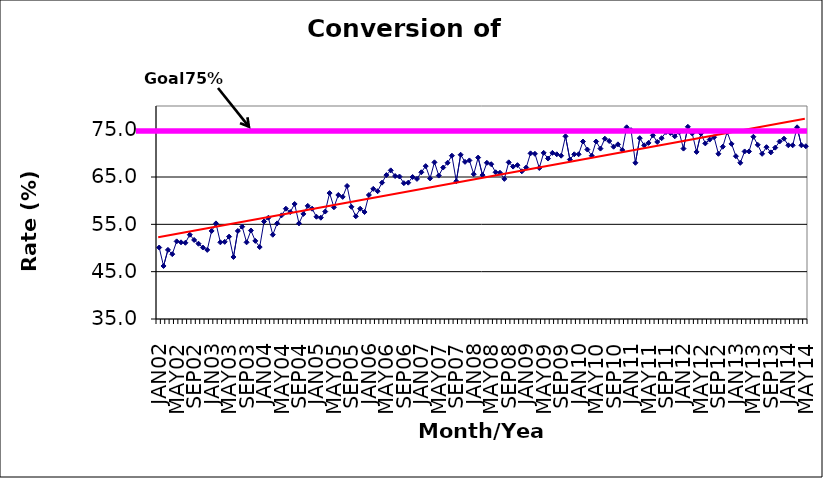
| Category | Series 0 |
|---|---|
| JAN02 | 50.1 |
| FEB02 | 46.2 |
| MAR02 | 49.6 |
| APR02 | 48.7 |
| MAY02 | 51.4 |
| JUN02 | 51.2 |
| JUL02 | 51.1 |
| AUG02 | 52.8 |
| SEP02 | 51.7 |
| OCT02 | 50.9 |
| NOV02 | 50.1 |
| DEC02 | 49.6 |
| JAN03 | 53.6 |
| FEB03 | 55.2 |
| MAR03 | 51.2 |
| APR03 | 51.3 |
| MAY03 | 52.4 |
| JUN03 | 48.1 |
| JUL03 | 53.6 |
| AUG03 | 54.5 |
| SEP03 | 51.2 |
| OCT03 | 53.7 |
| NOV03 | 51.5 |
| DEC03 | 50.2 |
| JAN04 | 55.6 |
| FEB04 | 56.4 |
| MAR04 | 52.8 |
| APR04 | 55.2 |
| MAY04 | 56.9 |
| JUN04 | 58.3 |
| JUL04 | 57.6 |
| AUG04 | 59.3 |
| SEP04 | 55.2 |
| OCT04 | 57.2 |
| NOV04 | 58.9 |
| DEC04 | 58.3 |
| JAN05 | 56.6 |
| FEB05 | 56.4 |
| MAR05 | 57.7 |
| APR05 | 61.6 |
| MAY05 | 58.6 |
| JUN05 | 61.2 |
| JUL05 | 60.8 |
| AUG05 | 63.1 |
| SEP05 | 58.7 |
| OCT05 | 56.7 |
| NOV05 | 58.3 |
| DEC05 | 57.6 |
| JAN06 | 61.2 |
| FEB06 | 62.5 |
| MAR06 | 62 |
| APR06 | 63.8 |
| MAY06 | 65.4 |
| JUN06 | 66.4 |
| JUL06 | 65.2 |
| AUG06 | 65.1 |
| SEP06 | 63.7 |
| OCT06 | 63.8 |
| NOV06 | 65 |
| DEC06 | 64.6 |
| JAN07 | 66 |
| FEB07 | 67.3 |
| MAR07 | 64.7 |
| APR07 | 68.1 |
| MAY07 | 65.3 |
| JUN07 | 67 |
| JUL07 | 68 |
| AUG07 | 69.5 |
| SEP07 | 64.1 |
| OCT07 | 69.7 |
| NOV07 | 68.2 |
| DEC07 | 68.5 |
| JAN08 | 65.6 |
| FEB08 | 69.1 |
| MAR08 | 65.4 |
| APR08 | 68 |
| MAY08 | 67.7 |
| JUN08 | 66 |
| JUL08 | 65.9 |
| AUG08 | 64.6 |
| SEP08 | 68.1 |
| OCT08 | 67.2 |
| NOV08 | 67.5 |
| DEC08 | 66.2 |
| JAN09 | 67 |
| FEB09 | 70 |
| MAR09 | 69.9 |
| APR09 | 66.9 |
| MAY09 | 70.1 |
| JUN09 | 68.9 |
| JUL09 | 70.1 |
| AUG09 | 69.8 |
| SEP09 | 69.5 |
| OCT09 | 73.6 |
| NOV09 | 68.7 |
| DEC09 | 69.8 |
| JAN10 | 69.8 |
| FEB10 | 72.5 |
| MAR10 | 70.8 |
| APR10 | 69.5 |
| MAY10 | 72.5 |
| JUN10 | 71 |
| JUL10 | 73.1 |
| AUG10 | 72.6 |
| SEP10 | 71.4 |
| OCT10 | 71.9 |
| NOV10 | 70.7 |
| DEC10 | 75.5 |
| JAN11 | 74.9 |
| FEB11 | 68 |
| MAR11 | 73.2 |
| APR11 | 71.7 |
| MAY11 | 72.2 |
| JUN11 | 73.8 |
| JUL11 | 72.4 |
| AUG11 | 73.2 |
| SEP11 | 74.5 |
| OCT11 | 74.3 |
| NOV11 | 73.6 |
| DEC11 | 74.5 |
| JAN12 | 71 |
| FEB12 | 75.6 |
| MAR12 | 74.2 |
| APR12 | 70.3 |
| MAY12 | 74.2 |
| JUN12 | 72.1 |
| JUL12 | 72.9 |
| AUG12 | 73.4 |
| SEP12 | 69.9 |
| OCT12 | 71.4 |
| NOV12 | 74.5 |
| DEC12 | 72 |
| JAN13 | 69.4 |
| FEB13 | 68 |
| MAR13 | 70.4 |
| APR13 | 70.4 |
| MAY13 | 73.5 |
| JUN13 | 71.8 |
| JUL13 | 69.9 |
| AUG13 | 71.3 |
| SEP13 | 70.2 |
| OCT13 | 71.2 |
| NOV13 | 72.5 |
| DEC13 | 73.1 |
| JAN14 | 71.7 |
| FEB14 | 71.7 |
| MAR14 | 75.5 |
| APR14 | 71.7 |
| MAY14 | 71.5 |